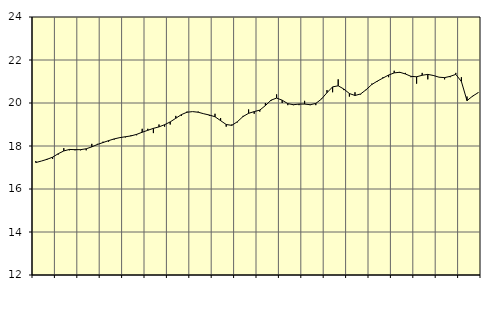
| Category | Piggar | Vård och omsorg, SNI 86-88 |
|---|---|---|
| nan | 17.3 | 17.23 |
| 1.0 | 17.3 | 17.3 |
| 1.0 | 17.4 | 17.38 |
| 1.0 | 17.4 | 17.48 |
| nan | 17.6 | 17.64 |
| 2.0 | 17.9 | 17.77 |
| 2.0 | 17.8 | 17.84 |
| 2.0 | 17.8 | 17.83 |
| nan | 17.8 | 17.83 |
| 3.0 | 17.8 | 17.87 |
| 3.0 | 18.1 | 17.96 |
| 3.0 | 18.1 | 18.07 |
| nan | 18.2 | 18.16 |
| 4.0 | 18.2 | 18.25 |
| 4.0 | 18.3 | 18.33 |
| 4.0 | 18.4 | 18.39 |
| nan | 18.4 | 18.43 |
| 5.0 | 18.5 | 18.47 |
| 5.0 | 18.5 | 18.54 |
| 5.0 | 18.8 | 18.64 |
| nan | 18.8 | 18.73 |
| 6.0 | 18.6 | 18.82 |
| 6.0 | 19 | 18.89 |
| 6.0 | 18.9 | 18.99 |
| nan | 19 | 19.12 |
| 7.0 | 19.4 | 19.29 |
| 7.0 | 19.4 | 19.46 |
| 7.0 | 19.6 | 19.57 |
| nan | 19.6 | 19.6 |
| 8.0 | 19.6 | 19.57 |
| 8.0 | 19.5 | 19.5 |
| 8.0 | 19.4 | 19.44 |
| nan | 19.5 | 19.36 |
| 9.0 | 19.3 | 19.18 |
| 9.0 | 18.9 | 19 |
| 9.0 | 19 | 18.96 |
| nan | 19.1 | 19.13 |
| 10.0 | 19.4 | 19.37 |
| 10.0 | 19.7 | 19.52 |
| 10.0 | 19.5 | 19.6 |
| nan | 19.6 | 19.67 |
| 11.0 | 20 | 19.88 |
| 11.0 | 20.1 | 20.13 |
| 11.0 | 20.4 | 20.23 |
| nan | 20 | 20.13 |
| 12.0 | 19.9 | 19.97 |
| 12.0 | 19.9 | 19.92 |
| 12.0 | 19.9 | 19.95 |
| nan | 20.1 | 19.95 |
| 13.0 | 19.9 | 19.92 |
| 13.0 | 19.9 | 19.98 |
| 13.0 | 20.2 | 20.18 |
| nan | 20.6 | 20.48 |
| 14.0 | 20.5 | 20.75 |
| 14.0 | 21.1 | 20.8 |
| 14.0 | 20.6 | 20.65 |
| nan | 20.3 | 20.44 |
| 15.0 | 20.5 | 20.35 |
| 15.0 | 20.4 | 20.42 |
| 15.0 | 20.6 | 20.62 |
| nan | 20.9 | 20.86 |
| 16.0 | 21 | 21.02 |
| 16.0 | 21.2 | 21.16 |
| 16.0 | 21.2 | 21.3 |
| nan | 21.5 | 21.4 |
| 17.0 | 21.4 | 21.43 |
| 17.0 | 21.4 | 21.35 |
| 17.0 | 21.2 | 21.24 |
| nan | 20.9 | 21.22 |
| 18.0 | 21.4 | 21.29 |
| 18.0 | 21.1 | 21.33 |
| 18.0 | 21.3 | 21.28 |
| nan | 21.2 | 21.2 |
| 19.0 | 21.1 | 21.18 |
| 19.0 | 21.2 | 21.24 |
| 19.0 | 21.4 | 21.33 |
| nan | 21.2 | 21 |
| 20.0 | 20.3 | 20.11 |
| 20.0 | 20.3 | 20.32 |
| 20.0 | 20.5 | 20.48 |